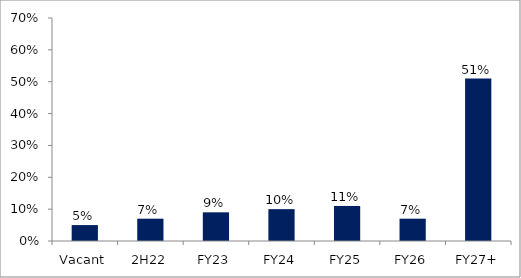
| Category | Series 0 |
|---|---|
| Vacant | 0.05 |
| 2H22 | 0.07 |
| FY23 | 0.09 |
| FY24 | 0.1 |
| FY25 | 0.11 |
| FY26 | 0.07 |
| FY27+ | 0.51 |